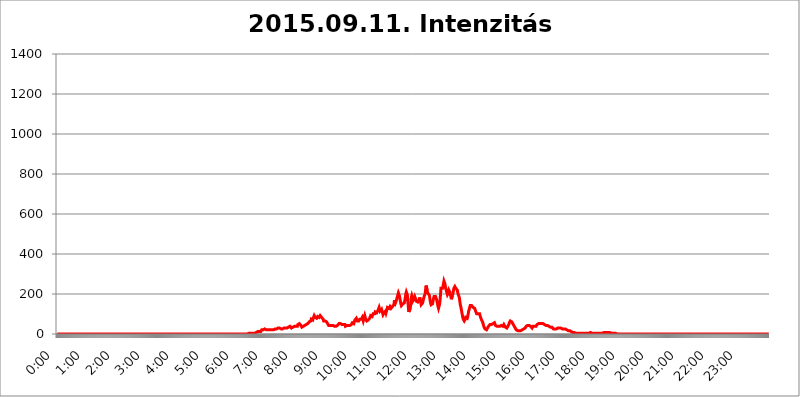
| Category | 2015.09.11. Intenzitás [W/m^2] |
|---|---|
| 0.0 | 0 |
| 0.0006944444444444445 | 0 |
| 0.001388888888888889 | 0 |
| 0.0020833333333333333 | 0 |
| 0.002777777777777778 | 0 |
| 0.003472222222222222 | 0 |
| 0.004166666666666667 | 0 |
| 0.004861111111111111 | 0 |
| 0.005555555555555556 | 0 |
| 0.0062499999999999995 | 0 |
| 0.006944444444444444 | 0 |
| 0.007638888888888889 | 0 |
| 0.008333333333333333 | 0 |
| 0.009027777777777779 | 0 |
| 0.009722222222222222 | 0 |
| 0.010416666666666666 | 0 |
| 0.011111111111111112 | 0 |
| 0.011805555555555555 | 0 |
| 0.012499999999999999 | 0 |
| 0.013194444444444444 | 0 |
| 0.013888888888888888 | 0 |
| 0.014583333333333332 | 0 |
| 0.015277777777777777 | 0 |
| 0.015972222222222224 | 0 |
| 0.016666666666666666 | 0 |
| 0.017361111111111112 | 0 |
| 0.018055555555555557 | 0 |
| 0.01875 | 0 |
| 0.019444444444444445 | 0 |
| 0.02013888888888889 | 0 |
| 0.020833333333333332 | 0 |
| 0.02152777777777778 | 0 |
| 0.022222222222222223 | 0 |
| 0.02291666666666667 | 0 |
| 0.02361111111111111 | 0 |
| 0.024305555555555556 | 0 |
| 0.024999999999999998 | 0 |
| 0.025694444444444447 | 0 |
| 0.02638888888888889 | 0 |
| 0.027083333333333334 | 0 |
| 0.027777777777777776 | 0 |
| 0.02847222222222222 | 0 |
| 0.029166666666666664 | 0 |
| 0.029861111111111113 | 0 |
| 0.030555555555555555 | 0 |
| 0.03125 | 0 |
| 0.03194444444444445 | 0 |
| 0.03263888888888889 | 0 |
| 0.03333333333333333 | 0 |
| 0.034027777777777775 | 0 |
| 0.034722222222222224 | 0 |
| 0.035416666666666666 | 0 |
| 0.036111111111111115 | 0 |
| 0.03680555555555556 | 0 |
| 0.0375 | 0 |
| 0.03819444444444444 | 0 |
| 0.03888888888888889 | 0 |
| 0.03958333333333333 | 0 |
| 0.04027777777777778 | 0 |
| 0.04097222222222222 | 0 |
| 0.041666666666666664 | 0 |
| 0.042361111111111106 | 0 |
| 0.04305555555555556 | 0 |
| 0.043750000000000004 | 0 |
| 0.044444444444444446 | 0 |
| 0.04513888888888889 | 0 |
| 0.04583333333333334 | 0 |
| 0.04652777777777778 | 0 |
| 0.04722222222222222 | 0 |
| 0.04791666666666666 | 0 |
| 0.04861111111111111 | 0 |
| 0.049305555555555554 | 0 |
| 0.049999999999999996 | 0 |
| 0.05069444444444445 | 0 |
| 0.051388888888888894 | 0 |
| 0.052083333333333336 | 0 |
| 0.05277777777777778 | 0 |
| 0.05347222222222222 | 0 |
| 0.05416666666666667 | 0 |
| 0.05486111111111111 | 0 |
| 0.05555555555555555 | 0 |
| 0.05625 | 0 |
| 0.05694444444444444 | 0 |
| 0.057638888888888885 | 0 |
| 0.05833333333333333 | 0 |
| 0.05902777777777778 | 0 |
| 0.059722222222222225 | 0 |
| 0.06041666666666667 | 0 |
| 0.061111111111111116 | 0 |
| 0.06180555555555556 | 0 |
| 0.0625 | 0 |
| 0.06319444444444444 | 0 |
| 0.06388888888888888 | 0 |
| 0.06458333333333334 | 0 |
| 0.06527777777777778 | 0 |
| 0.06597222222222222 | 0 |
| 0.06666666666666667 | 0 |
| 0.06736111111111111 | 0 |
| 0.06805555555555555 | 0 |
| 0.06874999999999999 | 0 |
| 0.06944444444444443 | 0 |
| 0.07013888888888889 | 0 |
| 0.07083333333333333 | 0 |
| 0.07152777777777779 | 0 |
| 0.07222222222222223 | 0 |
| 0.07291666666666667 | 0 |
| 0.07361111111111111 | 0 |
| 0.07430555555555556 | 0 |
| 0.075 | 0 |
| 0.07569444444444444 | 0 |
| 0.0763888888888889 | 0 |
| 0.07708333333333334 | 0 |
| 0.07777777777777778 | 0 |
| 0.07847222222222222 | 0 |
| 0.07916666666666666 | 0 |
| 0.0798611111111111 | 0 |
| 0.08055555555555556 | 0 |
| 0.08125 | 0 |
| 0.08194444444444444 | 0 |
| 0.08263888888888889 | 0 |
| 0.08333333333333333 | 0 |
| 0.08402777777777777 | 0 |
| 0.08472222222222221 | 0 |
| 0.08541666666666665 | 0 |
| 0.08611111111111112 | 0 |
| 0.08680555555555557 | 0 |
| 0.08750000000000001 | 0 |
| 0.08819444444444445 | 0 |
| 0.08888888888888889 | 0 |
| 0.08958333333333333 | 0 |
| 0.09027777777777778 | 0 |
| 0.09097222222222222 | 0 |
| 0.09166666666666667 | 0 |
| 0.09236111111111112 | 0 |
| 0.09305555555555556 | 0 |
| 0.09375 | 0 |
| 0.09444444444444444 | 0 |
| 0.09513888888888888 | 0 |
| 0.09583333333333333 | 0 |
| 0.09652777777777777 | 0 |
| 0.09722222222222222 | 0 |
| 0.09791666666666667 | 0 |
| 0.09861111111111111 | 0 |
| 0.09930555555555555 | 0 |
| 0.09999999999999999 | 0 |
| 0.10069444444444443 | 0 |
| 0.1013888888888889 | 0 |
| 0.10208333333333335 | 0 |
| 0.10277777777777779 | 0 |
| 0.10347222222222223 | 0 |
| 0.10416666666666667 | 0 |
| 0.10486111111111111 | 0 |
| 0.10555555555555556 | 0 |
| 0.10625 | 0 |
| 0.10694444444444444 | 0 |
| 0.1076388888888889 | 0 |
| 0.10833333333333334 | 0 |
| 0.10902777777777778 | 0 |
| 0.10972222222222222 | 0 |
| 0.1111111111111111 | 0 |
| 0.11180555555555556 | 0 |
| 0.11180555555555556 | 0 |
| 0.1125 | 0 |
| 0.11319444444444444 | 0 |
| 0.11388888888888889 | 0 |
| 0.11458333333333333 | 0 |
| 0.11527777777777777 | 0 |
| 0.11597222222222221 | 0 |
| 0.11666666666666665 | 0 |
| 0.1173611111111111 | 0 |
| 0.11805555555555557 | 0 |
| 0.11944444444444445 | 0 |
| 0.12013888888888889 | 0 |
| 0.12083333333333333 | 0 |
| 0.12152777777777778 | 0 |
| 0.12222222222222223 | 0 |
| 0.12291666666666667 | 0 |
| 0.12291666666666667 | 0 |
| 0.12361111111111112 | 0 |
| 0.12430555555555556 | 0 |
| 0.125 | 0 |
| 0.12569444444444444 | 0 |
| 0.12638888888888888 | 0 |
| 0.12708333333333333 | 0 |
| 0.16875 | 0 |
| 0.12847222222222224 | 0 |
| 0.12916666666666668 | 0 |
| 0.12986111111111112 | 0 |
| 0.13055555555555556 | 0 |
| 0.13125 | 0 |
| 0.13194444444444445 | 0 |
| 0.1326388888888889 | 0 |
| 0.13333333333333333 | 0 |
| 0.13402777777777777 | 0 |
| 0.13402777777777777 | 0 |
| 0.13472222222222222 | 0 |
| 0.13541666666666666 | 0 |
| 0.1361111111111111 | 0 |
| 0.13749999999999998 | 0 |
| 0.13819444444444443 | 0 |
| 0.1388888888888889 | 0 |
| 0.13958333333333334 | 0 |
| 0.14027777777777778 | 0 |
| 0.14097222222222222 | 0 |
| 0.14166666666666666 | 0 |
| 0.1423611111111111 | 0 |
| 0.14305555555555557 | 0 |
| 0.14375000000000002 | 0 |
| 0.14444444444444446 | 0 |
| 0.1451388888888889 | 0 |
| 0.1451388888888889 | 0 |
| 0.14652777777777778 | 0 |
| 0.14722222222222223 | 0 |
| 0.14791666666666667 | 0 |
| 0.1486111111111111 | 0 |
| 0.14930555555555555 | 0 |
| 0.15 | 0 |
| 0.15069444444444444 | 0 |
| 0.15138888888888888 | 0 |
| 0.15208333333333332 | 0 |
| 0.15277777777777776 | 0 |
| 0.15347222222222223 | 0 |
| 0.15416666666666667 | 0 |
| 0.15486111111111112 | 0 |
| 0.15555555555555556 | 0 |
| 0.15625 | 0 |
| 0.15694444444444444 | 0 |
| 0.15763888888888888 | 0 |
| 0.15833333333333333 | 0 |
| 0.15902777777777777 | 0 |
| 0.15972222222222224 | 0 |
| 0.16041666666666668 | 0 |
| 0.16111111111111112 | 0 |
| 0.16180555555555556 | 0 |
| 0.1625 | 0 |
| 0.16319444444444445 | 0 |
| 0.1638888888888889 | 0 |
| 0.16458333333333333 | 0 |
| 0.16527777777777777 | 0 |
| 0.16597222222222222 | 0 |
| 0.16666666666666666 | 0 |
| 0.1673611111111111 | 0 |
| 0.16805555555555554 | 0 |
| 0.16874999999999998 | 0 |
| 0.16944444444444443 | 0 |
| 0.17013888888888887 | 0 |
| 0.1708333333333333 | 0 |
| 0.17152777777777775 | 0 |
| 0.17222222222222225 | 0 |
| 0.1729166666666667 | 0 |
| 0.17361111111111113 | 0 |
| 0.17430555555555557 | 0 |
| 0.17500000000000002 | 0 |
| 0.17569444444444446 | 0 |
| 0.1763888888888889 | 0 |
| 0.17708333333333334 | 0 |
| 0.17777777777777778 | 0 |
| 0.17847222222222223 | 0 |
| 0.17916666666666667 | 0 |
| 0.1798611111111111 | 0 |
| 0.18055555555555555 | 0 |
| 0.18125 | 0 |
| 0.18194444444444444 | 0 |
| 0.1826388888888889 | 0 |
| 0.18333333333333335 | 0 |
| 0.1840277777777778 | 0 |
| 0.18472222222222223 | 0 |
| 0.18541666666666667 | 0 |
| 0.18611111111111112 | 0 |
| 0.18680555555555556 | 0 |
| 0.1875 | 0 |
| 0.18819444444444444 | 0 |
| 0.18888888888888888 | 0 |
| 0.18958333333333333 | 0 |
| 0.19027777777777777 | 0 |
| 0.1909722222222222 | 0 |
| 0.19166666666666665 | 0 |
| 0.19236111111111112 | 0 |
| 0.19305555555555554 | 0 |
| 0.19375 | 0 |
| 0.19444444444444445 | 0 |
| 0.1951388888888889 | 0 |
| 0.19583333333333333 | 0 |
| 0.19652777777777777 | 0 |
| 0.19722222222222222 | 0 |
| 0.19791666666666666 | 0 |
| 0.1986111111111111 | 0 |
| 0.19930555555555554 | 0 |
| 0.19999999999999998 | 0 |
| 0.20069444444444443 | 0 |
| 0.20138888888888887 | 0 |
| 0.2020833333333333 | 0 |
| 0.2027777777777778 | 0 |
| 0.2034722222222222 | 0 |
| 0.2041666666666667 | 0 |
| 0.20486111111111113 | 0 |
| 0.20555555555555557 | 0 |
| 0.20625000000000002 | 0 |
| 0.20694444444444446 | 0 |
| 0.2076388888888889 | 0 |
| 0.20833333333333334 | 0 |
| 0.20902777777777778 | 0 |
| 0.20972222222222223 | 0 |
| 0.21041666666666667 | 0 |
| 0.2111111111111111 | 0 |
| 0.21180555555555555 | 0 |
| 0.2125 | 0 |
| 0.21319444444444444 | 0 |
| 0.2138888888888889 | 0 |
| 0.21458333333333335 | 0 |
| 0.2152777777777778 | 0 |
| 0.21597222222222223 | 0 |
| 0.21666666666666667 | 0 |
| 0.21736111111111112 | 0 |
| 0.21805555555555556 | 0 |
| 0.21875 | 0 |
| 0.21944444444444444 | 0 |
| 0.22013888888888888 | 0 |
| 0.22083333333333333 | 0 |
| 0.22152777777777777 | 0 |
| 0.2222222222222222 | 0 |
| 0.22291666666666665 | 0 |
| 0.2236111111111111 | 0 |
| 0.22430555555555556 | 0 |
| 0.225 | 0 |
| 0.22569444444444445 | 0 |
| 0.2263888888888889 | 0 |
| 0.22708333333333333 | 0 |
| 0.22777777777777777 | 0 |
| 0.22847222222222222 | 0 |
| 0.22916666666666666 | 0 |
| 0.2298611111111111 | 0 |
| 0.23055555555555554 | 0 |
| 0.23124999999999998 | 0 |
| 0.23194444444444443 | 0 |
| 0.23263888888888887 | 0 |
| 0.2333333333333333 | 0 |
| 0.2340277777777778 | 0 |
| 0.2347222222222222 | 0 |
| 0.2354166666666667 | 0 |
| 0.23611111111111113 | 0 |
| 0.23680555555555557 | 0 |
| 0.23750000000000002 | 0 |
| 0.23819444444444446 | 0 |
| 0.2388888888888889 | 0 |
| 0.23958333333333334 | 0 |
| 0.24027777777777778 | 0 |
| 0.24097222222222223 | 0 |
| 0.24166666666666667 | 0 |
| 0.2423611111111111 | 0 |
| 0.24305555555555555 | 0 |
| 0.24375 | 0 |
| 0.24444444444444446 | 0 |
| 0.24513888888888888 | 0 |
| 0.24583333333333335 | 0 |
| 0.2465277777777778 | 0 |
| 0.24722222222222223 | 0 |
| 0.24791666666666667 | 0 |
| 0.24861111111111112 | 0 |
| 0.24930555555555556 | 0 |
| 0.25 | 0 |
| 0.25069444444444444 | 0 |
| 0.2513888888888889 | 0 |
| 0.2520833333333333 | 0 |
| 0.25277777777777777 | 0 |
| 0.2534722222222222 | 0 |
| 0.25416666666666665 | 0 |
| 0.2548611111111111 | 0 |
| 0.2555555555555556 | 0 |
| 0.25625000000000003 | 0 |
| 0.2569444444444445 | 0 |
| 0.2576388888888889 | 0 |
| 0.25833333333333336 | 0 |
| 0.2590277777777778 | 0 |
| 0.25972222222222224 | 0 |
| 0.2604166666666667 | 0 |
| 0.2611111111111111 | 0 |
| 0.26180555555555557 | 0 |
| 0.2625 | 0 |
| 0.26319444444444445 | 0 |
| 0.2638888888888889 | 0 |
| 0.26458333333333334 | 0 |
| 0.2652777777777778 | 0 |
| 0.2659722222222222 | 0 |
| 0.26666666666666666 | 0 |
| 0.2673611111111111 | 0 |
| 0.26805555555555555 | 0 |
| 0.26875 | 3.525 |
| 0.26944444444444443 | 3.525 |
| 0.2701388888888889 | 3.525 |
| 0.2708333333333333 | 3.525 |
| 0.27152777777777776 | 3.525 |
| 0.2722222222222222 | 3.525 |
| 0.27291666666666664 | 3.525 |
| 0.2736111111111111 | 3.525 |
| 0.2743055555555555 | 3.525 |
| 0.27499999999999997 | 3.525 |
| 0.27569444444444446 | 3.525 |
| 0.27638888888888885 | 3.525 |
| 0.27708333333333335 | 3.525 |
| 0.2777777777777778 | 3.525 |
| 0.27847222222222223 | 7.887 |
| 0.2791666666666667 | 7.887 |
| 0.2798611111111111 | 7.887 |
| 0.28055555555555556 | 7.887 |
| 0.28125 | 12.257 |
| 0.28194444444444444 | 12.257 |
| 0.2826388888888889 | 12.257 |
| 0.2833333333333333 | 12.257 |
| 0.28402777777777777 | 16.636 |
| 0.2847222222222222 | 12.257 |
| 0.28541666666666665 | 12.257 |
| 0.28611111111111115 | 16.636 |
| 0.28680555555555554 | 21.024 |
| 0.28750000000000003 | 21.024 |
| 0.2881944444444445 | 21.024 |
| 0.2888888888888889 | 21.024 |
| 0.28958333333333336 | 25.419 |
| 0.2902777777777778 | 25.419 |
| 0.29097222222222224 | 25.419 |
| 0.2916666666666667 | 21.024 |
| 0.2923611111111111 | 21.024 |
| 0.29305555555555557 | 21.024 |
| 0.29375 | 21.024 |
| 0.29444444444444445 | 21.024 |
| 0.2951388888888889 | 21.024 |
| 0.29583333333333334 | 21.024 |
| 0.2965277777777778 | 21.024 |
| 0.2972222222222222 | 21.024 |
| 0.29791666666666666 | 25.419 |
| 0.2986111111111111 | 25.419 |
| 0.29930555555555555 | 21.024 |
| 0.3 | 21.024 |
| 0.30069444444444443 | 21.024 |
| 0.3013888888888889 | 21.024 |
| 0.3020833333333333 | 21.024 |
| 0.30277777777777776 | 21.024 |
| 0.3034722222222222 | 21.024 |
| 0.30416666666666664 | 21.024 |
| 0.3048611111111111 | 25.419 |
| 0.3055555555555555 | 25.419 |
| 0.30624999999999997 | 25.419 |
| 0.3069444444444444 | 25.419 |
| 0.3076388888888889 | 25.419 |
| 0.30833333333333335 | 29.823 |
| 0.3090277777777778 | 29.823 |
| 0.30972222222222223 | 29.823 |
| 0.3104166666666667 | 34.234 |
| 0.3111111111111111 | 29.823 |
| 0.31180555555555556 | 29.823 |
| 0.3125 | 29.823 |
| 0.31319444444444444 | 25.419 |
| 0.3138888888888889 | 25.419 |
| 0.3145833333333333 | 25.419 |
| 0.31527777777777777 | 25.419 |
| 0.3159722222222222 | 25.419 |
| 0.31666666666666665 | 29.823 |
| 0.31736111111111115 | 29.823 |
| 0.31805555555555554 | 29.823 |
| 0.31875000000000003 | 29.823 |
| 0.3194444444444445 | 29.823 |
| 0.3201388888888889 | 29.823 |
| 0.32083333333333336 | 29.823 |
| 0.3215277777777778 | 29.823 |
| 0.32222222222222224 | 29.823 |
| 0.3229166666666667 | 29.823 |
| 0.3236111111111111 | 29.823 |
| 0.32430555555555557 | 34.234 |
| 0.325 | 34.234 |
| 0.32569444444444445 | 34.234 |
| 0.3263888888888889 | 38.653 |
| 0.32708333333333334 | 38.653 |
| 0.3277777777777778 | 34.234 |
| 0.3284722222222222 | 29.823 |
| 0.32916666666666666 | 29.823 |
| 0.3298611111111111 | 29.823 |
| 0.33055555555555555 | 34.234 |
| 0.33125 | 38.653 |
| 0.33194444444444443 | 38.653 |
| 0.3326388888888889 | 38.653 |
| 0.3333333333333333 | 38.653 |
| 0.3340277777777778 | 38.653 |
| 0.3347222222222222 | 38.653 |
| 0.3354166666666667 | 43.079 |
| 0.3361111111111111 | 43.079 |
| 0.3368055555555556 | 38.653 |
| 0.33749999999999997 | 47.511 |
| 0.33819444444444446 | 47.511 |
| 0.33888888888888885 | 47.511 |
| 0.33958333333333335 | 51.951 |
| 0.34027777777777773 | 51.951 |
| 0.34097222222222223 | 47.511 |
| 0.3416666666666666 | 43.079 |
| 0.3423611111111111 | 38.653 |
| 0.3430555555555555 | 34.234 |
| 0.34375 | 29.823 |
| 0.3444444444444445 | 34.234 |
| 0.3451388888888889 | 38.653 |
| 0.3458333333333334 | 38.653 |
| 0.34652777777777777 | 38.653 |
| 0.34722222222222227 | 43.079 |
| 0.34791666666666665 | 38.653 |
| 0.34861111111111115 | 43.079 |
| 0.34930555555555554 | 47.511 |
| 0.35000000000000003 | 47.511 |
| 0.3506944444444444 | 51.951 |
| 0.3513888888888889 | 51.951 |
| 0.3520833333333333 | 51.951 |
| 0.3527777777777778 | 56.398 |
| 0.3534722222222222 | 60.85 |
| 0.3541666666666667 | 65.31 |
| 0.3548611111111111 | 60.85 |
| 0.35555555555555557 | 65.31 |
| 0.35625 | 74.246 |
| 0.35694444444444445 | 78.722 |
| 0.3576388888888889 | 74.246 |
| 0.35833333333333334 | 69.775 |
| 0.3590277777777778 | 78.722 |
| 0.3597222222222222 | 83.205 |
| 0.36041666666666666 | 92.184 |
| 0.3611111111111111 | 87.692 |
| 0.36180555555555555 | 83.205 |
| 0.3625 | 78.722 |
| 0.36319444444444443 | 78.722 |
| 0.3638888888888889 | 78.722 |
| 0.3645833333333333 | 83.205 |
| 0.3652777777777778 | 87.692 |
| 0.3659722222222222 | 87.692 |
| 0.3666666666666667 | 83.205 |
| 0.3673611111111111 | 83.205 |
| 0.3680555555555556 | 87.692 |
| 0.36874999999999997 | 92.184 |
| 0.36944444444444446 | 92.184 |
| 0.37013888888888885 | 87.692 |
| 0.37083333333333335 | 83.205 |
| 0.37152777777777773 | 83.205 |
| 0.37222222222222223 | 78.722 |
| 0.3729166666666666 | 74.246 |
| 0.3736111111111111 | 65.31 |
| 0.3743055555555555 | 60.85 |
| 0.375 | 65.31 |
| 0.3756944444444445 | 65.31 |
| 0.3763888888888889 | 65.31 |
| 0.3770833333333334 | 65.31 |
| 0.37777777777777777 | 60.85 |
| 0.37847222222222227 | 56.398 |
| 0.37916666666666665 | 51.951 |
| 0.37986111111111115 | 47.511 |
| 0.38055555555555554 | 43.079 |
| 0.38125000000000003 | 43.079 |
| 0.3819444444444444 | 47.511 |
| 0.3826388888888889 | 43.079 |
| 0.3833333333333333 | 43.079 |
| 0.3840277777777778 | 43.079 |
| 0.3847222222222222 | 43.079 |
| 0.3854166666666667 | 47.511 |
| 0.3861111111111111 | 47.511 |
| 0.38680555555555557 | 43.079 |
| 0.3875 | 38.653 |
| 0.38819444444444445 | 38.653 |
| 0.3888888888888889 | 38.653 |
| 0.38958333333333334 | 34.234 |
| 0.3902777777777778 | 34.234 |
| 0.3909722222222222 | 38.653 |
| 0.39166666666666666 | 38.653 |
| 0.3923611111111111 | 43.079 |
| 0.39305555555555555 | 43.079 |
| 0.39375 | 43.079 |
| 0.39444444444444443 | 43.079 |
| 0.3951388888888889 | 51.951 |
| 0.3958333333333333 | 51.951 |
| 0.3965277777777778 | 51.951 |
| 0.3972222222222222 | 51.951 |
| 0.3979166666666667 | 47.511 |
| 0.3986111111111111 | 47.511 |
| 0.3993055555555556 | 47.511 |
| 0.39999999999999997 | 47.511 |
| 0.40069444444444446 | 47.511 |
| 0.40138888888888885 | 47.511 |
| 0.40208333333333335 | 47.511 |
| 0.40277777777777773 | 51.951 |
| 0.40347222222222223 | 47.511 |
| 0.4041666666666666 | 38.653 |
| 0.4048611111111111 | 38.653 |
| 0.4055555555555555 | 38.653 |
| 0.40625 | 43.079 |
| 0.4069444444444445 | 43.079 |
| 0.4076388888888889 | 43.079 |
| 0.4083333333333334 | 43.079 |
| 0.40902777777777777 | 38.653 |
| 0.40972222222222227 | 43.079 |
| 0.41041666666666665 | 43.079 |
| 0.41111111111111115 | 43.079 |
| 0.41180555555555554 | 47.511 |
| 0.41250000000000003 | 47.511 |
| 0.4131944444444444 | 51.951 |
| 0.4138888888888889 | 56.398 |
| 0.4145833333333333 | 56.398 |
| 0.4152777777777778 | 51.951 |
| 0.4159722222222222 | 51.951 |
| 0.4166666666666667 | 56.398 |
| 0.4173611111111111 | 69.775 |
| 0.41805555555555557 | 74.246 |
| 0.41875 | 74.246 |
| 0.41944444444444445 | 78.722 |
| 0.4201388888888889 | 74.246 |
| 0.42083333333333334 | 65.31 |
| 0.4215277777777778 | 60.85 |
| 0.4222222222222222 | 60.85 |
| 0.42291666666666666 | 65.31 |
| 0.4236111111111111 | 69.775 |
| 0.42430555555555555 | 74.246 |
| 0.425 | 74.246 |
| 0.42569444444444443 | 74.246 |
| 0.4263888888888889 | 74.246 |
| 0.4270833333333333 | 78.722 |
| 0.4277777777777778 | 83.205 |
| 0.4284722222222222 | 74.246 |
| 0.4291666666666667 | 65.31 |
| 0.4298611111111111 | 69.775 |
| 0.4305555555555556 | 83.205 |
| 0.43124999999999997 | 92.184 |
| 0.43194444444444446 | 83.205 |
| 0.43263888888888885 | 74.246 |
| 0.43333333333333335 | 69.775 |
| 0.43402777777777773 | 65.31 |
| 0.43472222222222223 | 65.31 |
| 0.4354166666666666 | 69.775 |
| 0.4361111111111111 | 69.775 |
| 0.4368055555555555 | 65.31 |
| 0.4375 | 74.246 |
| 0.4381944444444445 | 78.722 |
| 0.4388888888888889 | 78.722 |
| 0.4395833333333334 | 92.184 |
| 0.44027777777777777 | 92.184 |
| 0.44097222222222227 | 87.692 |
| 0.44166666666666665 | 87.692 |
| 0.44236111111111115 | 92.184 |
| 0.44305555555555554 | 101.184 |
| 0.44375000000000003 | 101.184 |
| 0.4444444444444444 | 96.682 |
| 0.4451388888888889 | 101.184 |
| 0.4458333333333333 | 110.201 |
| 0.4465277777777778 | 105.69 |
| 0.4472222222222222 | 110.201 |
| 0.4479166666666667 | 105.69 |
| 0.4486111111111111 | 101.184 |
| 0.44930555555555557 | 105.69 |
| 0.45 | 119.235 |
| 0.45069444444444445 | 123.758 |
| 0.4513888888888889 | 132.814 |
| 0.45208333333333334 | 128.284 |
| 0.4527777777777778 | 114.716 |
| 0.4534722222222222 | 119.235 |
| 0.45416666666666666 | 110.201 |
| 0.4548611111111111 | 123.758 |
| 0.45555555555555555 | 123.758 |
| 0.45625 | 105.69 |
| 0.45694444444444443 | 96.682 |
| 0.4576388888888889 | 101.184 |
| 0.4583333333333333 | 105.69 |
| 0.4590277777777778 | 105.69 |
| 0.4597222222222222 | 110.201 |
| 0.4604166666666667 | 114.716 |
| 0.4611111111111111 | 105.69 |
| 0.4618055555555556 | 110.201 |
| 0.46249999999999997 | 123.758 |
| 0.46319444444444446 | 132.814 |
| 0.46388888888888885 | 137.347 |
| 0.46458333333333335 | 137.347 |
| 0.46527777777777773 | 128.284 |
| 0.46597222222222223 | 128.284 |
| 0.4666666666666666 | 137.347 |
| 0.4673611111111111 | 137.347 |
| 0.4680555555555555 | 128.284 |
| 0.46875 | 123.758 |
| 0.4694444444444445 | 132.814 |
| 0.4701388888888889 | 137.347 |
| 0.4708333333333334 | 141.884 |
| 0.47152777777777777 | 132.814 |
| 0.47222222222222227 | 146.423 |
| 0.47291666666666665 | 169.156 |
| 0.47361111111111115 | 169.156 |
| 0.47430555555555554 | 155.509 |
| 0.47500000000000003 | 155.509 |
| 0.4756944444444444 | 169.156 |
| 0.4763888888888889 | 173.709 |
| 0.4770833333333333 | 187.378 |
| 0.4777777777777778 | 196.497 |
| 0.4784722222222222 | 205.62 |
| 0.4791666666666667 | 201.058 |
| 0.4798611111111111 | 191.937 |
| 0.48055555555555557 | 187.378 |
| 0.48125 | 164.605 |
| 0.48194444444444445 | 150.964 |
| 0.4826388888888889 | 141.884 |
| 0.48333333333333334 | 137.347 |
| 0.4840277777777778 | 146.423 |
| 0.4847222222222222 | 150.964 |
| 0.48541666666666666 | 155.509 |
| 0.4861111111111111 | 150.964 |
| 0.48680555555555555 | 155.509 |
| 0.4875 | 169.156 |
| 0.48819444444444443 | 182.82 |
| 0.4888888888888889 | 201.058 |
| 0.4895833333333333 | 210.182 |
| 0.4902777777777778 | 214.746 |
| 0.4909722222222222 | 196.497 |
| 0.4916666666666667 | 169.156 |
| 0.4923611111111111 | 137.347 |
| 0.4930555555555556 | 110.201 |
| 0.49374999999999997 | 105.69 |
| 0.49444444444444446 | 110.201 |
| 0.49513888888888885 | 128.284 |
| 0.49583333333333335 | 155.509 |
| 0.49652777777777773 | 182.82 |
| 0.49722222222222223 | 191.937 |
| 0.4979166666666666 | 182.82 |
| 0.4986111111111111 | 164.605 |
| 0.4993055555555555 | 164.605 |
| 0.5 | 173.709 |
| 0.5006944444444444 | 178.264 |
| 0.5013888888888889 | 187.378 |
| 0.5020833333333333 | 182.82 |
| 0.5027777777777778 | 173.709 |
| 0.5034722222222222 | 164.605 |
| 0.5041666666666667 | 164.605 |
| 0.5048611111111111 | 164.605 |
| 0.5055555555555555 | 160.056 |
| 0.50625 | 160.056 |
| 0.5069444444444444 | 164.605 |
| 0.5076388888888889 | 173.709 |
| 0.5083333333333333 | 182.82 |
| 0.5090277777777777 | 178.264 |
| 0.5097222222222222 | 160.056 |
| 0.5104166666666666 | 146.423 |
| 0.5111111111111112 | 141.884 |
| 0.5118055555555555 | 150.964 |
| 0.5125000000000001 | 155.509 |
| 0.5131944444444444 | 160.056 |
| 0.513888888888889 | 178.264 |
| 0.5145833333333333 | 187.378 |
| 0.5152777777777778 | 191.937 |
| 0.5159722222222222 | 201.058 |
| 0.5166666666666667 | 223.873 |
| 0.517361111111111 | 242.127 |
| 0.5180555555555556 | 237.564 |
| 0.5187499999999999 | 219.309 |
| 0.5194444444444445 | 205.62 |
| 0.5201388888888888 | 201.058 |
| 0.5208333333333334 | 201.058 |
| 0.5215277777777778 | 196.497 |
| 0.5222222222222223 | 187.378 |
| 0.5229166666666667 | 169.156 |
| 0.5236111111111111 | 155.509 |
| 0.5243055555555556 | 146.423 |
| 0.525 | 141.884 |
| 0.5256944444444445 | 146.423 |
| 0.5263888888888889 | 150.964 |
| 0.5270833333333333 | 164.605 |
| 0.5277777777777778 | 178.264 |
| 0.5284722222222222 | 187.378 |
| 0.5291666666666667 | 187.378 |
| 0.5298611111111111 | 187.378 |
| 0.5305555555555556 | 187.378 |
| 0.53125 | 182.82 |
| 0.5319444444444444 | 173.709 |
| 0.5326388888888889 | 169.156 |
| 0.5333333333333333 | 150.964 |
| 0.5340277777777778 | 137.347 |
| 0.5347222222222222 | 128.284 |
| 0.5354166666666667 | 132.814 |
| 0.5361111111111111 | 146.423 |
| 0.5368055555555555 | 164.605 |
| 0.5375 | 196.497 |
| 0.5381944444444444 | 228.436 |
| 0.5388888888888889 | 228.436 |
| 0.5395833333333333 | 228.436 |
| 0.5402777777777777 | 228.436 |
| 0.5409722222222222 | 237.564 |
| 0.5416666666666666 | 251.251 |
| 0.5423611111111112 | 264.932 |
| 0.5430555555555555 | 260.373 |
| 0.5437500000000001 | 251.251 |
| 0.5444444444444444 | 233 |
| 0.545138888888889 | 223.873 |
| 0.5458333333333333 | 214.746 |
| 0.5465277777777778 | 210.182 |
| 0.5472222222222222 | 196.497 |
| 0.5479166666666667 | 196.497 |
| 0.548611111111111 | 205.62 |
| 0.5493055555555556 | 219.309 |
| 0.5499999999999999 | 223.873 |
| 0.5506944444444445 | 210.182 |
| 0.5513888888888888 | 196.497 |
| 0.5520833333333334 | 187.378 |
| 0.5527777777777778 | 173.709 |
| 0.5534722222222223 | 178.264 |
| 0.5541666666666667 | 191.937 |
| 0.5548611111111111 | 201.058 |
| 0.5555555555555556 | 214.746 |
| 0.55625 | 228.436 |
| 0.5569444444444445 | 233 |
| 0.5576388888888889 | 237.564 |
| 0.5583333333333333 | 233 |
| 0.5590277777777778 | 228.436 |
| 0.5597222222222222 | 223.873 |
| 0.5604166666666667 | 228.436 |
| 0.5611111111111111 | 219.309 |
| 0.5618055555555556 | 205.62 |
| 0.5625 | 196.497 |
| 0.5631944444444444 | 196.497 |
| 0.5638888888888889 | 182.82 |
| 0.5645833333333333 | 164.605 |
| 0.5652777777777778 | 146.423 |
| 0.5659722222222222 | 137.347 |
| 0.5666666666666667 | 123.758 |
| 0.5673611111111111 | 110.201 |
| 0.5680555555555555 | 96.682 |
| 0.56875 | 83.205 |
| 0.5694444444444444 | 74.246 |
| 0.5701388888888889 | 69.775 |
| 0.5708333333333333 | 65.31 |
| 0.5715277777777777 | 69.775 |
| 0.5722222222222222 | 74.246 |
| 0.5729166666666666 | 83.205 |
| 0.5736111111111112 | 83.205 |
| 0.5743055555555555 | 78.722 |
| 0.5750000000000001 | 78.722 |
| 0.5756944444444444 | 87.692 |
| 0.576388888888889 | 101.184 |
| 0.5770833333333333 | 114.716 |
| 0.5777777777777778 | 123.758 |
| 0.5784722222222222 | 132.814 |
| 0.5791666666666667 | 141.884 |
| 0.579861111111111 | 146.423 |
| 0.5805555555555556 | 146.423 |
| 0.5812499999999999 | 141.884 |
| 0.5819444444444445 | 137.347 |
| 0.5826388888888888 | 137.347 |
| 0.5833333333333334 | 132.814 |
| 0.5840277777777778 | 137.347 |
| 0.5847222222222223 | 132.814 |
| 0.5854166666666667 | 128.284 |
| 0.5861111111111111 | 123.758 |
| 0.5868055555555556 | 114.716 |
| 0.5875 | 110.201 |
| 0.5881944444444445 | 101.184 |
| 0.5888888888888889 | 96.682 |
| 0.5895833333333333 | 96.682 |
| 0.5902777777777778 | 101.184 |
| 0.5909722222222222 | 105.69 |
| 0.5916666666666667 | 105.69 |
| 0.5923611111111111 | 101.184 |
| 0.5930555555555556 | 92.184 |
| 0.59375 | 83.205 |
| 0.5944444444444444 | 78.722 |
| 0.5951388888888889 | 69.775 |
| 0.5958333333333333 | 65.31 |
| 0.5965277777777778 | 60.85 |
| 0.5972222222222222 | 51.951 |
| 0.5979166666666667 | 43.079 |
| 0.5986111111111111 | 34.234 |
| 0.5993055555555555 | 29.823 |
| 0.6 | 25.419 |
| 0.6006944444444444 | 25.419 |
| 0.6013888888888889 | 21.024 |
| 0.6020833333333333 | 21.024 |
| 0.6027777777777777 | 25.419 |
| 0.6034722222222222 | 29.823 |
| 0.6041666666666666 | 34.234 |
| 0.6048611111111112 | 38.653 |
| 0.6055555555555555 | 43.079 |
| 0.6062500000000001 | 43.079 |
| 0.6069444444444444 | 47.511 |
| 0.607638888888889 | 47.511 |
| 0.6083333333333333 | 51.951 |
| 0.6090277777777778 | 47.511 |
| 0.6097222222222222 | 47.511 |
| 0.6104166666666667 | 47.511 |
| 0.611111111111111 | 51.951 |
| 0.6118055555555556 | 51.951 |
| 0.6124999999999999 | 56.398 |
| 0.6131944444444445 | 56.398 |
| 0.6138888888888888 | 51.951 |
| 0.6145833333333334 | 43.079 |
| 0.6152777777777778 | 38.653 |
| 0.6159722222222223 | 38.653 |
| 0.6166666666666667 | 38.653 |
| 0.6173611111111111 | 38.653 |
| 0.6180555555555556 | 38.653 |
| 0.61875 | 38.653 |
| 0.6194444444444445 | 38.653 |
| 0.6201388888888889 | 38.653 |
| 0.6208333333333333 | 38.653 |
| 0.6215277777777778 | 43.079 |
| 0.6222222222222222 | 43.079 |
| 0.6229166666666667 | 43.079 |
| 0.6236111111111111 | 43.079 |
| 0.6243055555555556 | 43.079 |
| 0.625 | 38.653 |
| 0.6256944444444444 | 43.079 |
| 0.6263888888888889 | 47.511 |
| 0.6270833333333333 | 47.511 |
| 0.6277777777777778 | 43.079 |
| 0.6284722222222222 | 34.234 |
| 0.6291666666666667 | 29.823 |
| 0.6298611111111111 | 29.823 |
| 0.6305555555555555 | 29.823 |
| 0.63125 | 34.234 |
| 0.6319444444444444 | 38.653 |
| 0.6326388888888889 | 43.079 |
| 0.6333333333333333 | 47.511 |
| 0.6340277777777777 | 56.398 |
| 0.6347222222222222 | 60.85 |
| 0.6354166666666666 | 65.31 |
| 0.6361111111111112 | 65.31 |
| 0.6368055555555555 | 65.31 |
| 0.6375000000000001 | 60.85 |
| 0.6381944444444444 | 56.398 |
| 0.638888888888889 | 51.951 |
| 0.6395833333333333 | 51.951 |
| 0.6402777777777778 | 47.511 |
| 0.6409722222222222 | 38.653 |
| 0.6416666666666667 | 34.234 |
| 0.642361111111111 | 29.823 |
| 0.6430555555555556 | 25.419 |
| 0.6437499999999999 | 21.024 |
| 0.6444444444444445 | 21.024 |
| 0.6451388888888888 | 21.024 |
| 0.6458333333333334 | 16.636 |
| 0.6465277777777778 | 16.636 |
| 0.6472222222222223 | 16.636 |
| 0.6479166666666667 | 16.636 |
| 0.6486111111111111 | 16.636 |
| 0.6493055555555556 | 16.636 |
| 0.65 | 16.636 |
| 0.6506944444444445 | 16.636 |
| 0.6513888888888889 | 21.024 |
| 0.6520833333333333 | 21.024 |
| 0.6527777777777778 | 25.419 |
| 0.6534722222222222 | 25.419 |
| 0.6541666666666667 | 25.419 |
| 0.6548611111111111 | 25.419 |
| 0.6555555555555556 | 29.823 |
| 0.65625 | 29.823 |
| 0.6569444444444444 | 34.234 |
| 0.6576388888888889 | 38.653 |
| 0.6583333333333333 | 38.653 |
| 0.6590277777777778 | 38.653 |
| 0.6597222222222222 | 43.079 |
| 0.6604166666666667 | 43.079 |
| 0.6611111111111111 | 43.079 |
| 0.6618055555555555 | 43.079 |
| 0.6625 | 43.079 |
| 0.6631944444444444 | 38.653 |
| 0.6638888888888889 | 38.653 |
| 0.6645833333333333 | 34.234 |
| 0.6652777777777777 | 34.234 |
| 0.6659722222222222 | 29.823 |
| 0.6666666666666666 | 34.234 |
| 0.6673611111111111 | 38.653 |
| 0.6680555555555556 | 38.653 |
| 0.6687500000000001 | 38.653 |
| 0.6694444444444444 | 38.653 |
| 0.6701388888888888 | 38.653 |
| 0.6708333333333334 | 38.653 |
| 0.6715277777777778 | 38.653 |
| 0.6722222222222222 | 38.653 |
| 0.6729166666666666 | 47.511 |
| 0.6736111111111112 | 47.511 |
| 0.6743055555555556 | 51.951 |
| 0.6749999999999999 | 51.951 |
| 0.6756944444444444 | 51.951 |
| 0.6763888888888889 | 51.951 |
| 0.6770833333333334 | 51.951 |
| 0.6777777777777777 | 51.951 |
| 0.6784722222222223 | 51.951 |
| 0.6791666666666667 | 51.951 |
| 0.6798611111111111 | 51.951 |
| 0.6805555555555555 | 51.951 |
| 0.68125 | 51.951 |
| 0.6819444444444445 | 51.951 |
| 0.6826388888888889 | 47.511 |
| 0.6833333333333332 | 47.511 |
| 0.6840277777777778 | 47.511 |
| 0.6847222222222222 | 43.079 |
| 0.6854166666666667 | 43.079 |
| 0.686111111111111 | 43.079 |
| 0.6868055555555556 | 43.079 |
| 0.6875 | 43.079 |
| 0.6881944444444444 | 38.653 |
| 0.688888888888889 | 38.653 |
| 0.6895833333333333 | 38.653 |
| 0.6902777777777778 | 38.653 |
| 0.6909722222222222 | 38.653 |
| 0.6916666666666668 | 34.234 |
| 0.6923611111111111 | 34.234 |
| 0.6930555555555555 | 34.234 |
| 0.69375 | 34.234 |
| 0.6944444444444445 | 29.823 |
| 0.6951388888888889 | 29.823 |
| 0.6958333333333333 | 25.419 |
| 0.6965277777777777 | 25.419 |
| 0.6972222222222223 | 25.419 |
| 0.6979166666666666 | 25.419 |
| 0.6986111111111111 | 25.419 |
| 0.6993055555555556 | 25.419 |
| 0.7000000000000001 | 25.419 |
| 0.7006944444444444 | 25.419 |
| 0.7013888888888888 | 25.419 |
| 0.7020833333333334 | 29.823 |
| 0.7027777777777778 | 29.823 |
| 0.7034722222222222 | 29.823 |
| 0.7041666666666666 | 29.823 |
| 0.7048611111111112 | 29.823 |
| 0.7055555555555556 | 29.823 |
| 0.7062499999999999 | 29.823 |
| 0.7069444444444444 | 25.419 |
| 0.7076388888888889 | 25.419 |
| 0.7083333333333334 | 25.419 |
| 0.7090277777777777 | 25.419 |
| 0.7097222222222223 | 25.419 |
| 0.7104166666666667 | 25.419 |
| 0.7111111111111111 | 25.419 |
| 0.7118055555555555 | 25.419 |
| 0.7125 | 25.419 |
| 0.7131944444444445 | 25.419 |
| 0.7138888888888889 | 21.024 |
| 0.7145833333333332 | 21.024 |
| 0.7152777777777778 | 21.024 |
| 0.7159722222222222 | 21.024 |
| 0.7166666666666667 | 16.636 |
| 0.717361111111111 | 16.636 |
| 0.7180555555555556 | 16.636 |
| 0.71875 | 16.636 |
| 0.7194444444444444 | 16.636 |
| 0.720138888888889 | 12.257 |
| 0.7208333333333333 | 12.257 |
| 0.7215277777777778 | 12.257 |
| 0.7222222222222222 | 12.257 |
| 0.7229166666666668 | 7.887 |
| 0.7236111111111111 | 7.887 |
| 0.7243055555555555 | 7.887 |
| 0.725 | 7.887 |
| 0.7256944444444445 | 7.887 |
| 0.7263888888888889 | 3.525 |
| 0.7270833333333333 | 3.525 |
| 0.7277777777777777 | 3.525 |
| 0.7284722222222223 | 3.525 |
| 0.7291666666666666 | 3.525 |
| 0.7298611111111111 | 3.525 |
| 0.7305555555555556 | 3.525 |
| 0.7312500000000001 | 3.525 |
| 0.7319444444444444 | 3.525 |
| 0.7326388888888888 | 3.525 |
| 0.7333333333333334 | 3.525 |
| 0.7340277777777778 | 3.525 |
| 0.7347222222222222 | 3.525 |
| 0.7354166666666666 | 3.525 |
| 0.7361111111111112 | 3.525 |
| 0.7368055555555556 | 3.525 |
| 0.7374999999999999 | 3.525 |
| 0.7381944444444444 | 3.525 |
| 0.7388888888888889 | 3.525 |
| 0.7395833333333334 | 3.525 |
| 0.7402777777777777 | 3.525 |
| 0.7409722222222223 | 3.525 |
| 0.7416666666666667 | 3.525 |
| 0.7423611111111111 | 3.525 |
| 0.7430555555555555 | 3.525 |
| 0.74375 | 3.525 |
| 0.7444444444444445 | 3.525 |
| 0.7451388888888889 | 3.525 |
| 0.7458333333333332 | 3.525 |
| 0.7465277777777778 | 3.525 |
| 0.7472222222222222 | 3.525 |
| 0.7479166666666667 | 7.887 |
| 0.748611111111111 | 7.887 |
| 0.7493055555555556 | 7.887 |
| 0.75 | 3.525 |
| 0.7506944444444444 | 3.525 |
| 0.751388888888889 | 3.525 |
| 0.7520833333333333 | 3.525 |
| 0.7527777777777778 | 3.525 |
| 0.7534722222222222 | 3.525 |
| 0.7541666666666668 | 3.525 |
| 0.7548611111111111 | 3.525 |
| 0.7555555555555555 | 3.525 |
| 0.75625 | 3.525 |
| 0.7569444444444445 | 3.525 |
| 0.7576388888888889 | 3.525 |
| 0.7583333333333333 | 3.525 |
| 0.7590277777777777 | 3.525 |
| 0.7597222222222223 | 3.525 |
| 0.7604166666666666 | 3.525 |
| 0.7611111111111111 | 3.525 |
| 0.7618055555555556 | 3.525 |
| 0.7625000000000001 | 3.525 |
| 0.7631944444444444 | 3.525 |
| 0.7638888888888888 | 3.525 |
| 0.7645833333333334 | 3.525 |
| 0.7652777777777778 | 3.525 |
| 0.7659722222222222 | 7.887 |
| 0.7666666666666666 | 7.887 |
| 0.7673611111111112 | 7.887 |
| 0.7680555555555556 | 7.887 |
| 0.7687499999999999 | 7.887 |
| 0.7694444444444444 | 7.887 |
| 0.7701388888888889 | 7.887 |
| 0.7708333333333334 | 7.887 |
| 0.7715277777777777 | 7.887 |
| 0.7722222222222223 | 7.887 |
| 0.7729166666666667 | 7.887 |
| 0.7736111111111111 | 7.887 |
| 0.7743055555555555 | 7.887 |
| 0.775 | 7.887 |
| 0.7756944444444445 | 7.887 |
| 0.7763888888888889 | 7.887 |
| 0.7770833333333332 | 3.525 |
| 0.7777777777777778 | 3.525 |
| 0.7784722222222222 | 3.525 |
| 0.7791666666666667 | 3.525 |
| 0.779861111111111 | 3.525 |
| 0.7805555555555556 | 3.525 |
| 0.78125 | 3.525 |
| 0.7819444444444444 | 3.525 |
| 0.782638888888889 | 3.525 |
| 0.7833333333333333 | 3.525 |
| 0.7840277777777778 | 3.525 |
| 0.7847222222222222 | 0 |
| 0.7854166666666668 | 0 |
| 0.7861111111111111 | 0 |
| 0.7868055555555555 | 0 |
| 0.7875 | 0 |
| 0.7881944444444445 | 0 |
| 0.7888888888888889 | 0 |
| 0.7895833333333333 | 0 |
| 0.7902777777777777 | 0 |
| 0.7909722222222223 | 0 |
| 0.7916666666666666 | 0 |
| 0.7923611111111111 | 0 |
| 0.7930555555555556 | 0 |
| 0.7937500000000001 | 0 |
| 0.7944444444444444 | 0 |
| 0.7951388888888888 | 0 |
| 0.7958333333333334 | 0 |
| 0.7965277777777778 | 0 |
| 0.7972222222222222 | 0 |
| 0.7979166666666666 | 0 |
| 0.7986111111111112 | 0 |
| 0.7993055555555556 | 0 |
| 0.7999999999999999 | 0 |
| 0.8006944444444444 | 0 |
| 0.8013888888888889 | 0 |
| 0.8020833333333334 | 0 |
| 0.8027777777777777 | 0 |
| 0.8034722222222223 | 0 |
| 0.8041666666666667 | 0 |
| 0.8048611111111111 | 0 |
| 0.8055555555555555 | 0 |
| 0.80625 | 0 |
| 0.8069444444444445 | 0 |
| 0.8076388888888889 | 0 |
| 0.8083333333333332 | 0 |
| 0.8090277777777778 | 0 |
| 0.8097222222222222 | 0 |
| 0.8104166666666667 | 0 |
| 0.811111111111111 | 0 |
| 0.8118055555555556 | 0 |
| 0.8125 | 0 |
| 0.8131944444444444 | 0 |
| 0.813888888888889 | 0 |
| 0.8145833333333333 | 0 |
| 0.8152777777777778 | 0 |
| 0.8159722222222222 | 0 |
| 0.8166666666666668 | 0 |
| 0.8173611111111111 | 0 |
| 0.8180555555555555 | 0 |
| 0.81875 | 0 |
| 0.8194444444444445 | 0 |
| 0.8201388888888889 | 0 |
| 0.8208333333333333 | 0 |
| 0.8215277777777777 | 0 |
| 0.8222222222222223 | 0 |
| 0.8229166666666666 | 0 |
| 0.8236111111111111 | 0 |
| 0.8243055555555556 | 0 |
| 0.8250000000000001 | 0 |
| 0.8256944444444444 | 0 |
| 0.8263888888888888 | 0 |
| 0.8270833333333334 | 0 |
| 0.8277777777777778 | 0 |
| 0.8284722222222222 | 0 |
| 0.8291666666666666 | 0 |
| 0.8298611111111112 | 0 |
| 0.8305555555555556 | 0 |
| 0.8312499999999999 | 0 |
| 0.8319444444444444 | 0 |
| 0.8326388888888889 | 0 |
| 0.8333333333333334 | 0 |
| 0.8340277777777777 | 0 |
| 0.8347222222222223 | 0 |
| 0.8354166666666667 | 0 |
| 0.8361111111111111 | 0 |
| 0.8368055555555555 | 0 |
| 0.8375 | 0 |
| 0.8381944444444445 | 0 |
| 0.8388888888888889 | 0 |
| 0.8395833333333332 | 0 |
| 0.8402777777777778 | 0 |
| 0.8409722222222222 | 0 |
| 0.8416666666666667 | 0 |
| 0.842361111111111 | 0 |
| 0.8430555555555556 | 0 |
| 0.84375 | 0 |
| 0.8444444444444444 | 0 |
| 0.845138888888889 | 0 |
| 0.8458333333333333 | 0 |
| 0.8465277777777778 | 0 |
| 0.8472222222222222 | 0 |
| 0.8479166666666668 | 0 |
| 0.8486111111111111 | 0 |
| 0.8493055555555555 | 0 |
| 0.85 | 0 |
| 0.8506944444444445 | 0 |
| 0.8513888888888889 | 0 |
| 0.8520833333333333 | 0 |
| 0.8527777777777777 | 0 |
| 0.8534722222222223 | 0 |
| 0.8541666666666666 | 0 |
| 0.8548611111111111 | 0 |
| 0.8555555555555556 | 0 |
| 0.8562500000000001 | 0 |
| 0.8569444444444444 | 0 |
| 0.8576388888888888 | 0 |
| 0.8583333333333334 | 0 |
| 0.8590277777777778 | 0 |
| 0.8597222222222222 | 0 |
| 0.8604166666666666 | 0 |
| 0.8611111111111112 | 0 |
| 0.8618055555555556 | 0 |
| 0.8624999999999999 | 0 |
| 0.8631944444444444 | 0 |
| 0.8638888888888889 | 0 |
| 0.8645833333333334 | 0 |
| 0.8652777777777777 | 0 |
| 0.8659722222222223 | 0 |
| 0.8666666666666667 | 0 |
| 0.8673611111111111 | 0 |
| 0.8680555555555555 | 0 |
| 0.86875 | 0 |
| 0.8694444444444445 | 0 |
| 0.8701388888888889 | 0 |
| 0.8708333333333332 | 0 |
| 0.8715277777777778 | 0 |
| 0.8722222222222222 | 0 |
| 0.8729166666666667 | 0 |
| 0.873611111111111 | 0 |
| 0.8743055555555556 | 0 |
| 0.875 | 0 |
| 0.8756944444444444 | 0 |
| 0.876388888888889 | 0 |
| 0.8770833333333333 | 0 |
| 0.8777777777777778 | 0 |
| 0.8784722222222222 | 0 |
| 0.8791666666666668 | 0 |
| 0.8798611111111111 | 0 |
| 0.8805555555555555 | 0 |
| 0.88125 | 0 |
| 0.8819444444444445 | 0 |
| 0.8826388888888889 | 0 |
| 0.8833333333333333 | 0 |
| 0.8840277777777777 | 0 |
| 0.8847222222222223 | 0 |
| 0.8854166666666666 | 0 |
| 0.8861111111111111 | 0 |
| 0.8868055555555556 | 0 |
| 0.8875000000000001 | 0 |
| 0.8881944444444444 | 0 |
| 0.8888888888888888 | 0 |
| 0.8895833333333334 | 0 |
| 0.8902777777777778 | 0 |
| 0.8909722222222222 | 0 |
| 0.8916666666666666 | 0 |
| 0.8923611111111112 | 0 |
| 0.8930555555555556 | 0 |
| 0.8937499999999999 | 0 |
| 0.8944444444444444 | 0 |
| 0.8951388888888889 | 0 |
| 0.8958333333333334 | 0 |
| 0.8965277777777777 | 0 |
| 0.8972222222222223 | 0 |
| 0.8979166666666667 | 0 |
| 0.8986111111111111 | 0 |
| 0.8993055555555555 | 0 |
| 0.9 | 0 |
| 0.9006944444444445 | 0 |
| 0.9013888888888889 | 0 |
| 0.9020833333333332 | 0 |
| 0.9027777777777778 | 0 |
| 0.9034722222222222 | 0 |
| 0.9041666666666667 | 0 |
| 0.904861111111111 | 0 |
| 0.9055555555555556 | 0 |
| 0.90625 | 0 |
| 0.9069444444444444 | 0 |
| 0.907638888888889 | 0 |
| 0.9083333333333333 | 0 |
| 0.9090277777777778 | 0 |
| 0.9097222222222222 | 0 |
| 0.9104166666666668 | 0 |
| 0.9111111111111111 | 0 |
| 0.9118055555555555 | 0 |
| 0.9125 | 0 |
| 0.9131944444444445 | 0 |
| 0.9138888888888889 | 0 |
| 0.9145833333333333 | 0 |
| 0.9152777777777777 | 0 |
| 0.9159722222222223 | 0 |
| 0.9166666666666666 | 0 |
| 0.9173611111111111 | 0 |
| 0.9180555555555556 | 0 |
| 0.9187500000000001 | 0 |
| 0.9194444444444444 | 0 |
| 0.9201388888888888 | 0 |
| 0.9208333333333334 | 0 |
| 0.9215277777777778 | 0 |
| 0.9222222222222222 | 0 |
| 0.9229166666666666 | 0 |
| 0.9236111111111112 | 0 |
| 0.9243055555555556 | 0 |
| 0.9249999999999999 | 0 |
| 0.9256944444444444 | 0 |
| 0.9263888888888889 | 0 |
| 0.9270833333333334 | 0 |
| 0.9277777777777777 | 0 |
| 0.9284722222222223 | 0 |
| 0.9291666666666667 | 0 |
| 0.9298611111111111 | 0 |
| 0.9305555555555555 | 0 |
| 0.93125 | 0 |
| 0.9319444444444445 | 0 |
| 0.9326388888888889 | 0 |
| 0.9333333333333332 | 0 |
| 0.9340277777777778 | 0 |
| 0.9347222222222222 | 0 |
| 0.9354166666666667 | 0 |
| 0.936111111111111 | 0 |
| 0.9368055555555556 | 0 |
| 0.9375 | 0 |
| 0.9381944444444444 | 0 |
| 0.938888888888889 | 0 |
| 0.9395833333333333 | 0 |
| 0.9402777777777778 | 0 |
| 0.9409722222222222 | 0 |
| 0.9416666666666668 | 0 |
| 0.9423611111111111 | 0 |
| 0.9430555555555555 | 0 |
| 0.94375 | 0 |
| 0.9444444444444445 | 0 |
| 0.9451388888888889 | 0 |
| 0.9458333333333333 | 0 |
| 0.9465277777777777 | 0 |
| 0.9472222222222223 | 0 |
| 0.9479166666666666 | 0 |
| 0.9486111111111111 | 0 |
| 0.9493055555555556 | 0 |
| 0.9500000000000001 | 0 |
| 0.9506944444444444 | 0 |
| 0.9513888888888888 | 0 |
| 0.9520833333333334 | 0 |
| 0.9527777777777778 | 0 |
| 0.9534722222222222 | 0 |
| 0.9541666666666666 | 0 |
| 0.9548611111111112 | 0 |
| 0.9555555555555556 | 0 |
| 0.9562499999999999 | 0 |
| 0.9569444444444444 | 0 |
| 0.9576388888888889 | 0 |
| 0.9583333333333334 | 0 |
| 0.9590277777777777 | 0 |
| 0.9597222222222223 | 0 |
| 0.9604166666666667 | 0 |
| 0.9611111111111111 | 0 |
| 0.9618055555555555 | 0 |
| 0.9625 | 0 |
| 0.9631944444444445 | 0 |
| 0.9638888888888889 | 0 |
| 0.9645833333333332 | 0 |
| 0.9652777777777778 | 0 |
| 0.9659722222222222 | 0 |
| 0.9666666666666667 | 0 |
| 0.967361111111111 | 0 |
| 0.9680555555555556 | 0 |
| 0.96875 | 0 |
| 0.9694444444444444 | 0 |
| 0.970138888888889 | 0 |
| 0.9708333333333333 | 0 |
| 0.9715277777777778 | 0 |
| 0.9722222222222222 | 0 |
| 0.9729166666666668 | 0 |
| 0.9736111111111111 | 0 |
| 0.9743055555555555 | 0 |
| 0.975 | 0 |
| 0.9756944444444445 | 0 |
| 0.9763888888888889 | 0 |
| 0.9770833333333333 | 0 |
| 0.9777777777777777 | 0 |
| 0.9784722222222223 | 0 |
| 0.9791666666666666 | 0 |
| 0.9798611111111111 | 0 |
| 0.9805555555555556 | 0 |
| 0.9812500000000001 | 0 |
| 0.9819444444444444 | 0 |
| 0.9826388888888888 | 0 |
| 0.9833333333333334 | 0 |
| 0.9840277777777778 | 0 |
| 0.9847222222222222 | 0 |
| 0.9854166666666666 | 0 |
| 0.9861111111111112 | 0 |
| 0.9868055555555556 | 0 |
| 0.9874999999999999 | 0 |
| 0.9881944444444444 | 0 |
| 0.9888888888888889 | 0 |
| 0.9895833333333334 | 0 |
| 0.9902777777777777 | 0 |
| 0.9909722222222223 | 0 |
| 0.9916666666666667 | 0 |
| 0.9923611111111111 | 0 |
| 0.9930555555555555 | 0 |
| 0.99375 | 0 |
| 0.9944444444444445 | 0 |
| 0.9951388888888889 | 0 |
| 0.9958333333333332 | 0 |
| 0.9965277777777778 | 0 |
| 0.9972222222222222 | 0 |
| 0.9979166666666667 | 0 |
| 0.998611111111111 | 0 |
| 0.9993055555555556 | 0 |